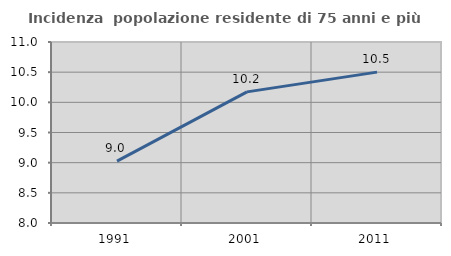
| Category | Incidenza  popolazione residente di 75 anni e più |
|---|---|
| 1991.0 | 9.026 |
| 2001.0 | 10.174 |
| 2011.0 | 10.501 |